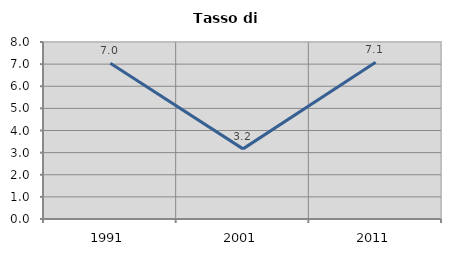
| Category | Tasso di disoccupazione   |
|---|---|
| 1991.0 | 7.038 |
| 2001.0 | 3.169 |
| 2011.0 | 7.088 |